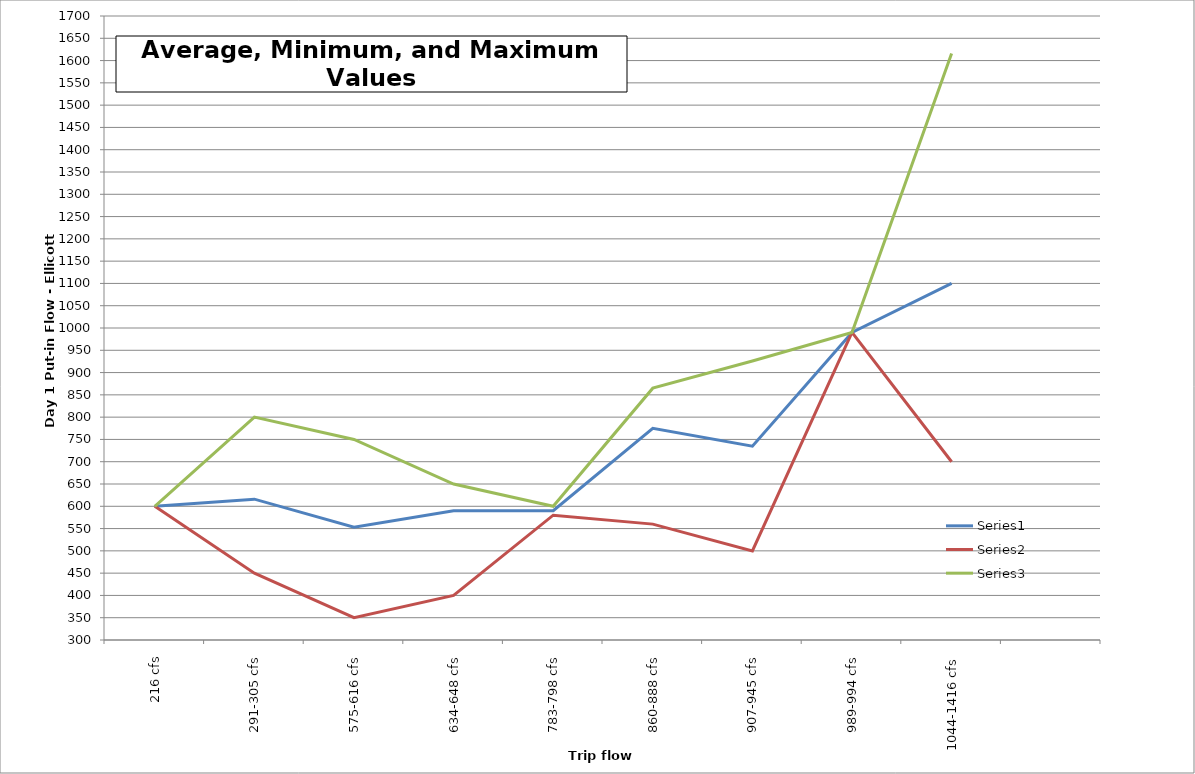
| Category | Series 0 | Series 1 | Series 2 |
|---|---|---|---|
| 216 cfs | 600 | 600 | 600 |
| 291-305 cfs | 616 | 450 | 800 |
| 575-616 cfs | 553 | 350 | 750 |
| 634-648 cfs | 590 | 400 | 650 |
| 783-798 cfs | 590 | 580 | 600 |
| 860-888 cfs | 775 | 560 | 865 |
| 907-945 cfs | 735 | 500 | 926 |
| 989-994 cfs | 990 | 990 | 990 |
| 1044-1416 cfs | 1100 | 700 | 1616 |